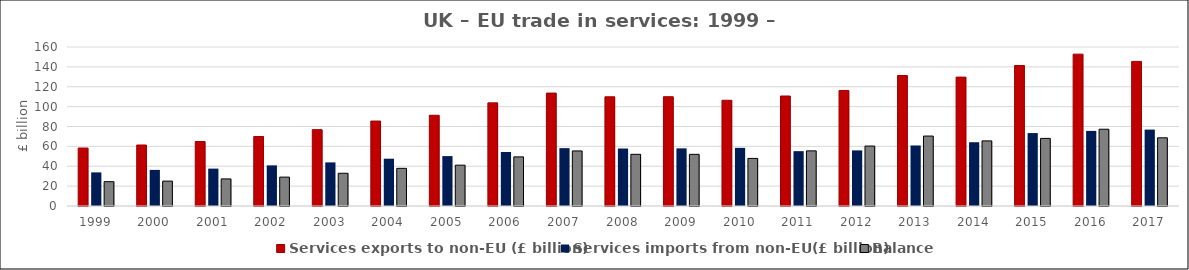
| Category | Services exports to non-EU (£ billion) | Services imports from non-EU(£ billion) | Balance |
|---|---|---|---|
| 1999.0 | 58.327 | 33.833 | 24.494 |
| 2000.0 | 61.381 | 36.341 | 25.04 |
| 2001.0 | 64.877 | 37.622 | 27.255 |
| 2002.0 | 69.941 | 40.877 | 29.063 |
| 2003.0 | 76.819 | 43.887 | 32.933 |
| 2004.0 | 85.487 | 47.587 | 37.9 |
| 2005.0 | 91.305 | 50.216 | 41.09 |
| 2006.0 | 103.783 | 54.364 | 49.419 |
| 2007.0 | 113.626 | 58.215 | 55.411 |
| 2008.0 | 109.875 | 57.853 | 52.022 |
| 2009.0 | 109.984 | 58.009 | 51.975 |
| 2010.0 | 106.394 | 58.512 | 47.883 |
| 2011.0 | 110.691 | 55.195 | 55.496 |
| 2012.0 | 116.275 | 55.958 | 60.317 |
| 2013.0 | 131.291 | 60.906 | 70.384 |
| 2014.0 | 129.689 | 64.173 | 65.516 |
| 2015.0 | 141.41 | 73.385 | 68.025 |
| 2016.0 | 152.813 | 75.561 | 77.252 |
| 2017.0 | 145.529 | 76.886 | 68.643 |